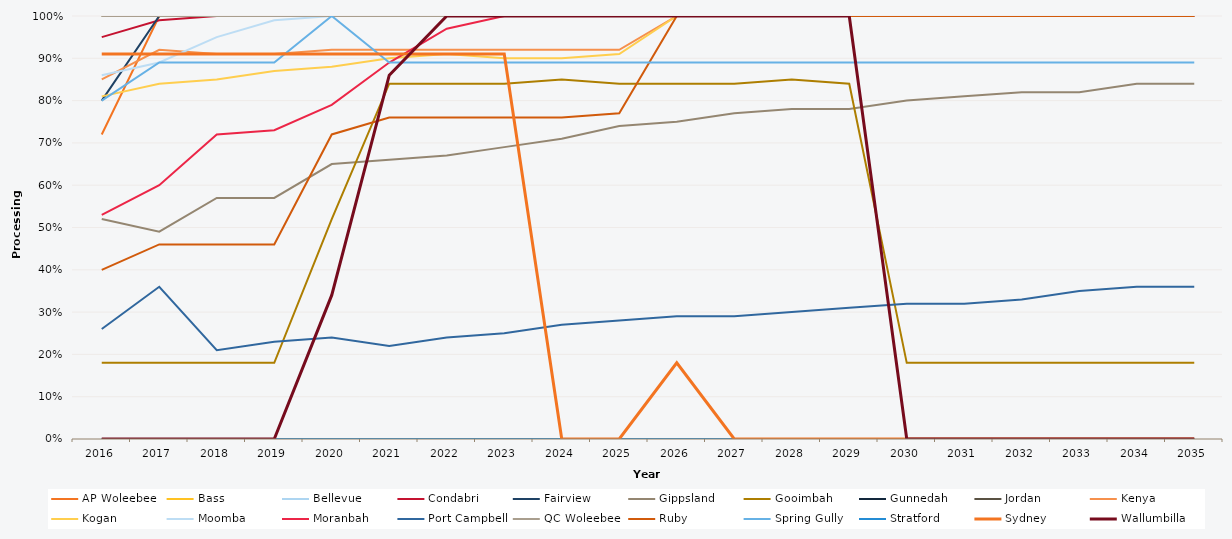
| Category | AP Woleebee | Bass | Bellevue | Condabri | Fairview | Gippsland | Gooimbah | Gunnedah | Jordan | Kenya | Kogan | Moomba | Moranbah | Port Campbell | QC Woleebee | Ruby | Spring Gully | Stratford | Sydney | Wallumbilla |
|---|---|---|---|---|---|---|---|---|---|---|---|---|---|---|---|---|---|---|---|---|
| 2016.0 | 0.72 | 1 | 1 | 0.95 | 0.8 | 0.52 | 0.18 | 0 | 1 | 0.85 | 0.81 | 0.86 | 0.53 | 0.26 | 1 | 0.4 | 0.8 | 0 | 0.91 | 0 |
| 2017.0 | 1 | 1 | 1 | 0.99 | 1 | 0.49 | 0.18 | 0 | 1 | 0.92 | 0.84 | 0.89 | 0.6 | 0.36 | 1 | 0.46 | 0.89 | 0 | 0.91 | 0 |
| 2018.0 | 1 | 1 | 1 | 1 | 1 | 0.57 | 0.18 | 0 | 1 | 0.91 | 0.85 | 0.95 | 0.72 | 0.21 | 1 | 0.46 | 0.89 | 0 | 0.91 | 0 |
| 2019.0 | 1 | 1 | 1 | 1 | 1 | 0.57 | 0.18 | 0 | 1 | 0.91 | 0.87 | 0.99 | 0.73 | 0.23 | 1 | 0.46 | 0.89 | 0 | 0.91 | 0 |
| 2020.0 | 1 | 1 | 1 | 1 | 1 | 0.65 | 0.52 | 0 | 1 | 0.92 | 0.88 | 1 | 0.79 | 0.24 | 1 | 0.72 | 1 | 0 | 0.91 | 0.34 |
| 2021.0 | 1 | 1 | 1 | 1 | 1 | 0.66 | 0.84 | 0 | 1 | 0.92 | 0.9 | 1 | 0.89 | 0.22 | 1 | 0.76 | 0.89 | 0 | 0.91 | 0.86 |
| 2022.0 | 1 | 1 | 1 | 1 | 1 | 0.67 | 0.84 | 0 | 1 | 0.92 | 0.91 | 1 | 0.97 | 0.24 | 1 | 0.76 | 0.89 | 0 | 0.91 | 1 |
| 2023.0 | 1 | 1 | 1 | 1 | 1 | 0.69 | 0.84 | 0 | 1 | 0.92 | 0.9 | 1 | 1 | 0.25 | 1 | 0.76 | 0.89 | 0 | 0.91 | 1 |
| 2024.0 | 1 | 1 | 1 | 1 | 1 | 0.71 | 0.85 | 0 | 1 | 0.92 | 0.9 | 1 | 1 | 0.27 | 1 | 0.76 | 0.89 | 0 | 0 | 1 |
| 2025.0 | 1 | 1 | 1 | 1 | 1 | 0.74 | 0.84 | 0 | 1 | 0.92 | 0.91 | 1 | 1 | 0.28 | 1 | 0.77 | 0.89 | 0 | 0 | 1 |
| 2026.0 | 1 | 1 | 1 | 1 | 1 | 0.75 | 0.84 | 0 | 1 | 1 | 1 | 1 | 1 | 0.29 | 1 | 1 | 0.89 | 0 | 0.18 | 1 |
| 2027.0 | 1 | 1 | 1 | 1 | 1 | 0.77 | 0.84 | 0 | 1 | 1 | 1 | 1 | 1 | 0.29 | 1 | 1 | 0.89 | 0 | 0 | 1 |
| 2028.0 | 1 | 1 | 1 | 1 | 1 | 0.78 | 0.85 | 0 | 1 | 1 | 1 | 1 | 1 | 0.3 | 1 | 1 | 0.89 | 0 | 0 | 1 |
| 2029.0 | 1 | 1 | 1 | 1 | 1 | 0.78 | 0.84 | 0 | 1 | 1 | 1 | 1 | 1 | 0.31 | 1 | 1 | 0.89 | 0 | 0 | 1 |
| 2030.0 | 1 | 1 | 1 | 1 | 1 | 0.8 | 0.18 | 0 | 1 | 1 | 1 | 1 | 1 | 0.32 | 1 | 1 | 0.89 | 0 | 0 | 0 |
| 2031.0 | 1 | 1 | 1 | 1 | 1 | 0.81 | 0.18 | 0 | 1 | 1 | 1 | 1 | 1 | 0.32 | 1 | 1 | 0.89 | 0 | 0 | 0 |
| 2032.0 | 1 | 1 | 1 | 1 | 1 | 0.82 | 0.18 | 0 | 1 | 1 | 1 | 1 | 1 | 0.33 | 1 | 1 | 0.89 | 0 | 0 | 0 |
| 2033.0 | 1 | 1 | 1 | 1 | 1 | 0.82 | 0.18 | 0 | 1 | 1 | 1 | 1 | 1 | 0.35 | 1 | 1 | 0.89 | 0 | 0 | 0 |
| 2034.0 | 1 | 1 | 1 | 1 | 1 | 0.84 | 0.18 | 0 | 1 | 1 | 1 | 1 | 1 | 0.36 | 1 | 1 | 0.89 | 0 | 0 | 0 |
| 2035.0 | 1 | 1 | 1 | 1 | 1 | 0.84 | 0.18 | 0 | 1 | 1 | 1 | 1 | 1 | 0.36 | 1 | 1 | 0.89 | 0 | 0 | 0 |